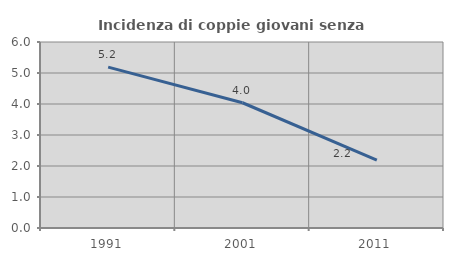
| Category | Incidenza di coppie giovani senza figli |
|---|---|
| 1991.0 | 5.189 |
| 2001.0 | 4.04 |
| 2011.0 | 2.186 |